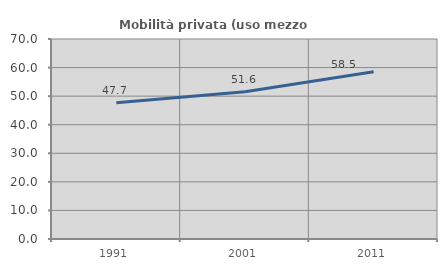
| Category | Mobilità privata (uso mezzo privato) |
|---|---|
| 1991.0 | 47.692 |
| 2001.0 | 51.562 |
| 2011.0 | 58.519 |